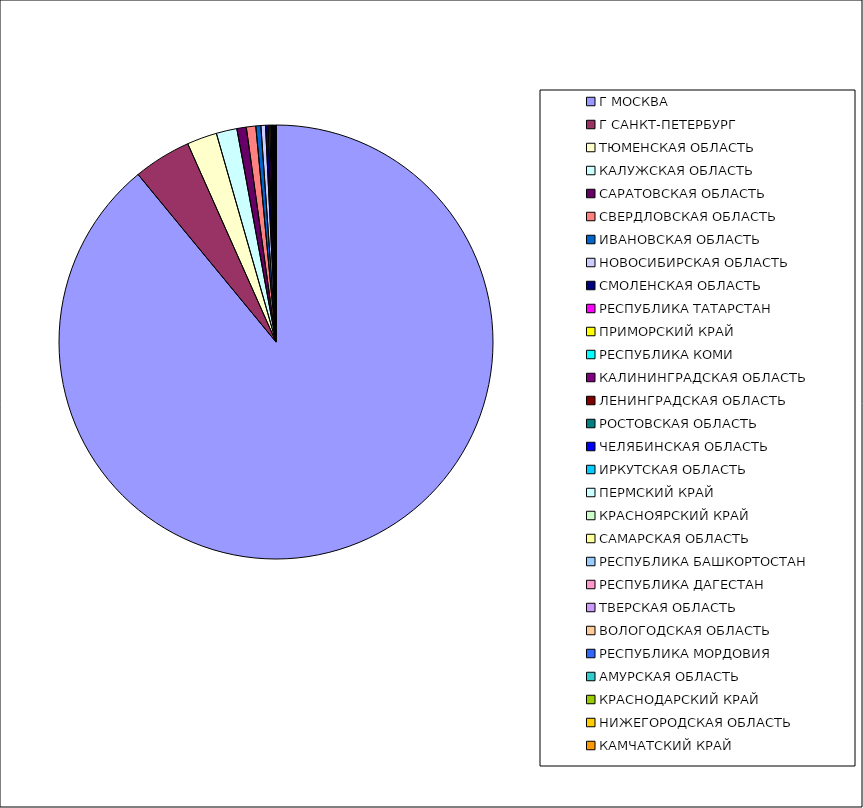
| Category | Оборот |
|---|---|
| Г МОСКВА | 0.89 |
| Г САНКТ-ПЕТЕРБУРГ | 0.043 |
| ТЮМЕНСКАЯ ОБЛАСТЬ | 0.022 |
| КАЛУЖСКАЯ ОБЛАСТЬ | 0.015 |
| САРАТОВСКАЯ ОБЛАСТЬ | 0.007 |
| СВЕРДЛОВСКАЯ ОБЛАСТЬ | 0.007 |
| ИВАНОВСКАЯ ОБЛАСТЬ | 0.004 |
| НОВОСИБИРСКАЯ ОБЛАСТЬ | 0.003 |
| СМОЛЕНСКАЯ ОБЛАСТЬ | 0.002 |
| РЕСПУБЛИКА ТАТАРСТАН | 0.001 |
| ПРИМОРСКИЙ КРАЙ | 0.001 |
| РЕСПУБЛИКА КОМИ | 0.001 |
| КАЛИНИНГРАДСКАЯ ОБЛАСТЬ | 0 |
| ЛЕНИНГРАДСКАЯ ОБЛАСТЬ | 0 |
| РОСТОВСКАЯ ОБЛАСТЬ | 0 |
| ЧЕЛЯБИНСКАЯ ОБЛАСТЬ | 0 |
| ИРКУТСКАЯ ОБЛАСТЬ | 0 |
| ПЕРМСКИЙ КРАЙ | 0 |
| КРАСНОЯРСКИЙ КРАЙ | 0 |
| САМАРСКАЯ ОБЛАСТЬ | 0 |
| РЕСПУБЛИКА БАШКОРТОСТАН | 0 |
| РЕСПУБЛИКА ДАГЕСТАН | 0 |
| ТВЕРСКАЯ ОБЛАСТЬ | 0 |
| ВОЛОГОДСКАЯ ОБЛАСТЬ | 0 |
| РЕСПУБЛИКА МОРДОВИЯ | 0 |
| АМУРСКАЯ ОБЛАСТЬ | 0 |
| КРАСНОДАРСКИЙ КРАЙ | 0 |
| НИЖЕГОРОДСКАЯ ОБЛАСТЬ | 0 |
| КАМЧАТСКИЙ КРАЙ | 0 |